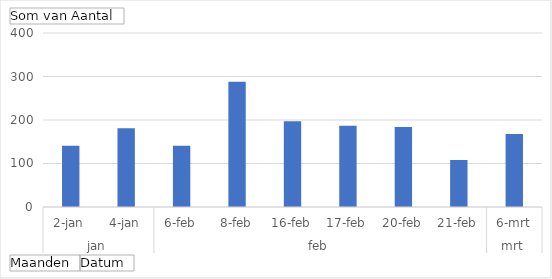
| Category | Totaal |
|---|---|
| 0 | 141 |
| 1 | 181 |
| 2 | 141 |
| 3 | 288 |
| 4 | 197 |
| 5 | 187 |
| 6 | 184 |
| 7 | 108 |
| 8 | 168 |